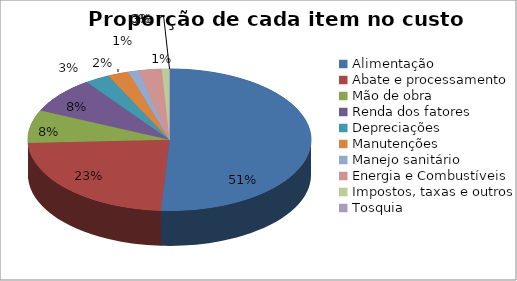
| Category | Series 0 | Series 1 |
|---|---|---|
| Alimentação | 0.664 | 0.664 |
| Abate e processamento | 0.304 | 0.304 |
| Mão de obra | 0.098 | 0.098 |
| Renda dos fatores | 0.108 | 0.108 |
| Depreciações | 0.037 | 0.037 |
| Manutenções | 0.031 | 0.031 |
| Manejo sanitário | 0.016 | 0.016 |
| Energia e Combustíveis | 0.034 | 0.034 |
| Impostos, taxas e outros | 0.012 | 0.012 |
| Tosquia | 0 | 0 |